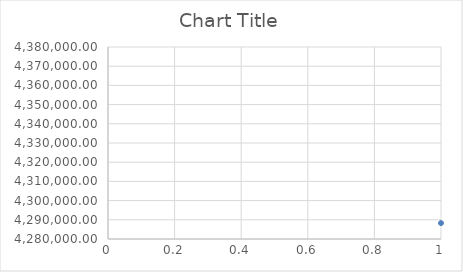
| Category | Series 0 |
|---|---|
| 0 | 4288294.209 |
| 1 | 4292752.107 |
| 2 | 4301027.632 |
| 3 | 4304952.355 |
| 4 | 4308106.666 |
| 5 | 4309917.434 |
| 6 | 4311330.919 |
| 7 | 4314672.948 |
| 8 | 4318680.989 |
| 9 | 4325727.983 |
| 10 | 4328455.784 |
| 11 | 4334783.716 |
| 12 | 4338611.793 |
| 13 | 4339545.448 |
| 14 | 4350965.726 |
| 15 | 4351822.848 |
| 16 | 4356786.821 |
| 17 | 4361622.99 |
| 18 | 4365747.341 |